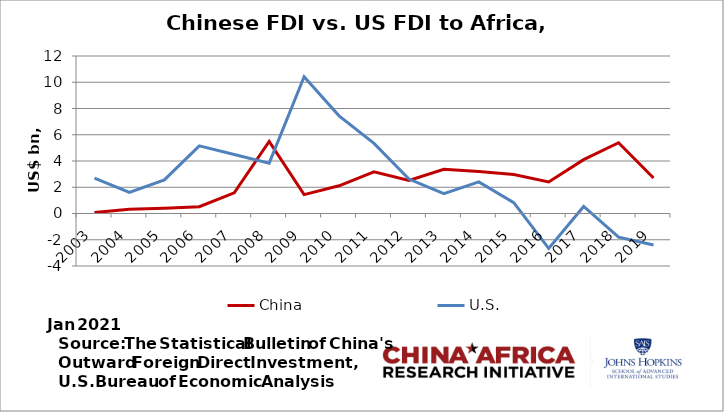
| Category | China | U.S. |
|---|---|---|
| 2003.0 | 0.075 | 2.697 |
| 2004.0 | 0.317 | 1.611 |
| 2005.0 | 0.392 | 2.564 |
| 2006.0 | 0.52 | 5.157 |
| 2007.0 | 1.574 | 4.49 |
| 2008.0 | 5.491 | 3.837 |
| 2009.0 | 1.439 | 10.417 |
| 2010.0 | 2.112 | 7.442 |
| 2011.0 | 3.173 | 5.34 |
| 2012.0 | 2.517 | 2.624 |
| 2013.0 | 3.371 | 1.516 |
| 2014.0 | 3.202 | 2.405 |
| 2015.0 | 2.978 | 0.829 |
| 2016.0 | 2.399 | -2.66 |
| 2017.0 | 4.105 | 0.534 |
| 2018.0 | 5.389 | -1.8 |
| 2019.0 | 2.704 | -2.395 |